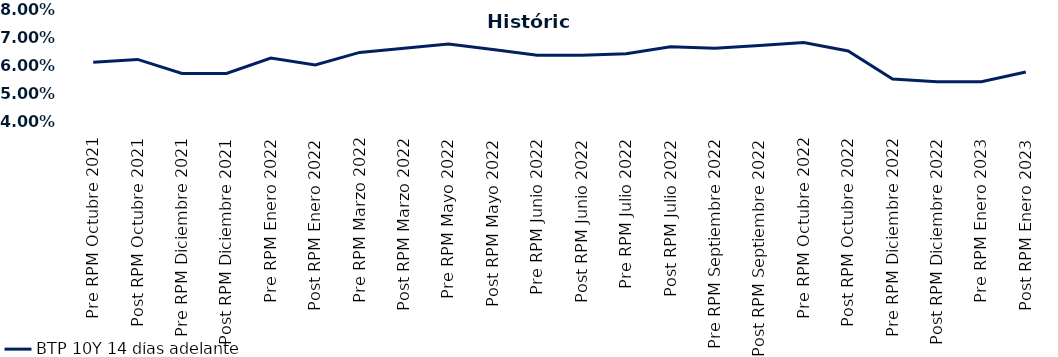
| Category | BTP 10Y 14 días adelante |
|---|---|
| Pre RPM Octubre 2021 | 0.061 |
| Post RPM Octubre 2021 | 0.062 |
| Pre RPM Diciembre 2021 | 0.057 |
| Post RPM Diciembre 2021 | 0.057 |
| Pre RPM Enero 2022 | 0.062 |
| Post RPM Enero 2022 | 0.06 |
| Pre RPM Marzo 2022 | 0.064 |
| Post RPM Marzo 2022 | 0.066 |
| Pre RPM Mayo 2022 | 0.068 |
| Post RPM Mayo 2022 | 0.066 |
| Pre RPM Junio 2022 | 0.064 |
| Post RPM Junio 2022 | 0.064 |
| Pre RPM Julio 2022 | 0.064 |
| Post RPM Julio 2022 | 0.066 |
| Pre RPM Septiembre 2022 | 0.066 |
| Post RPM Septiembre 2022 | 0.067 |
| Pre RPM Octubre 2022 | 0.068 |
| Post RPM Octubre 2022 | 0.065 |
| Pre RPM Diciembre 2022 | 0.055 |
| Post RPM Diciembre 2022 | 0.054 |
| Pre RPM Enero 2023 | 0.054 |
| Post RPM Enero 2023 | 0.058 |